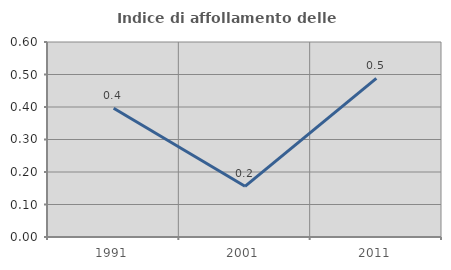
| Category | Indice di affollamento delle abitazioni  |
|---|---|
| 1991.0 | 0.396 |
| 2001.0 | 0.156 |
| 2011.0 | 0.488 |